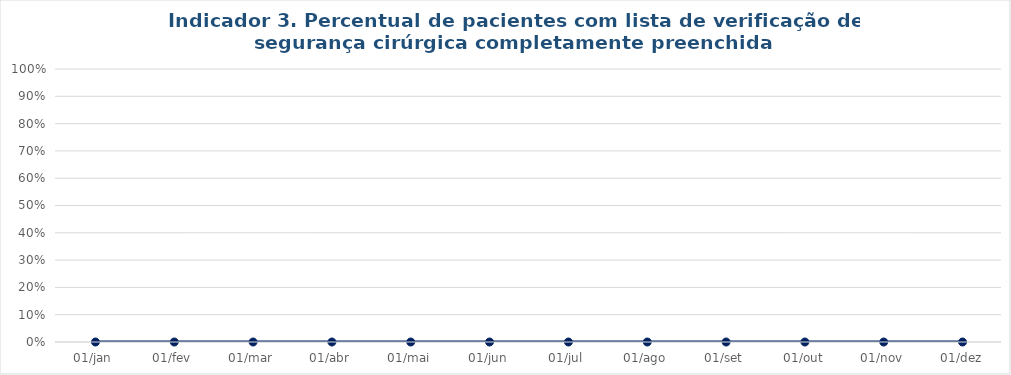
| Category | Total |
|---|---|
| 01/jan | 0 |
| 01/fev | 0 |
| 01/mar | 0 |
| 01/abr | 0 |
| 01/mai | 0 |
| 01/jun | 0 |
| 01/jul | 0 |
| 01/ago | 0 |
| 01/set | 0 |
| 01/out | 0 |
| 01/nov | 0 |
| 01/dez | 0 |